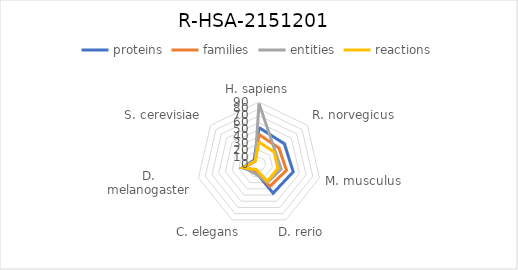
| Category | proteins | families | entities | reactions |
|---|---|---|---|---|
| H. sapiens | 53 | 43 | 88 | 32 |
| R. norvegicus | 47 | 37 | 30 | 28 |
| M. musculus | 51 | 41 | 33 | 28 |
| D. rerio | 47 | 36 | 29 | 28 |
| C. elegans | 12 | 11 | 15 | 9 |
| D. melanogaster | 25 | 22 | 23 | 24 |
| S. cerevisiae | 9 | 7 | 7 | 7 |